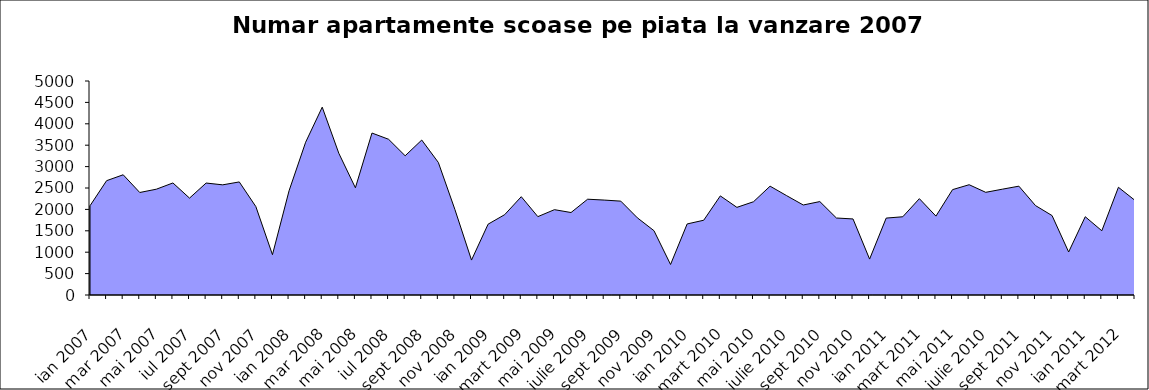
| Category | Total oferte scoase la vanzare in 2007 |
|---|---|
| ian 2007 | 2085 |
| feb 2007 | 2671 |
| mar 2007 | 2809 |
| apr 2007 | 2395 |
| mai 2007 | 2472 |
| iun 2007 | 2618 |
| iul 2007 | 2264 |
| aug 2007 | 2616 |
| sept 2007 | 2574 |
| oct 2007 | 2642 |
| nov 2007 | 2065 |
| dec 2007 | 942 |
| ian 2008 | 2435 |
| feb 2008 | 3569 |
| mar 2008 | 4389 |
| apr 2008 | 3312 |
| mai 2008 | 2505 |
| iun 2008 | 3784 |
| iul 2008 | 3639 |
| aug 2008 | 3253 |
| sept 2008 | 3621 |
| oct 2008 | 3097 |
| nov 2008 | 1997 |
| dec 2008 | 816 |
| ian 2009 | 1655 |
| feb 2009 | 1877 |
| mart 2009 | 2297 |
| apr 2009 | 1831 |
| mai 2009 | 1994 |
| iunie 2009 | 1927 |
| iulie 2009 | 2238 |
| aug 2009 | 2218 |
| sept 2009 | 2193 |
| oct 2009 | 1803 |
| nov 2009 | 1503 |
| dec 2009 | 713 |
| ian 2010 | 1660 |
| febr 2010 | 1747 |
| mart 2010 | 2316 |
| apr 2010 | 2048 |
| mai 2010 | 2179 |
| iunie 2010 | 2543 |
| iulie 2010 | 2321 |
| aug 2009 | 2103 |
| sept 2010 | 2183 |
| oct 2010 | 1799 |
| nov 2010 | 1777 |
| dec 2010 | 839 |
| ian 2011 | 1797 |
| febr 2011 | 1828 |
| mart 2011 | 2251 |
| apr 2011 | 1843 |
| mai 2011 | 2462 |
| iunie 2011 | 2577 |
| iulie 2010 | 2399 |
| aug 2011 | 2472 |
| sept 2011 | 2543 |
| oct 2011 | 2090 |
| nov 2011 | 1856 |
| dec 2011 | 1005 |
| ian 2011 | 1829 |
| febr 2012 | 1501 |
| mart 2012 | 2517 |
| apr 2012 | 2210 |